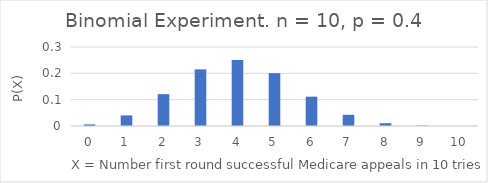
| Category | P(X) |
|---|---|
| 0.0 | 0.006 |
| 1.0 | 0.04 |
| 2.0 | 0.121 |
| 3.0 | 0.215 |
| 4.0 | 0.251 |
| 5.0 | 0.201 |
| 6.0 | 0.111 |
| 7.0 | 0.042 |
| 8.0 | 0.011 |
| 9.0 | 0.002 |
| 10.0 | 0 |